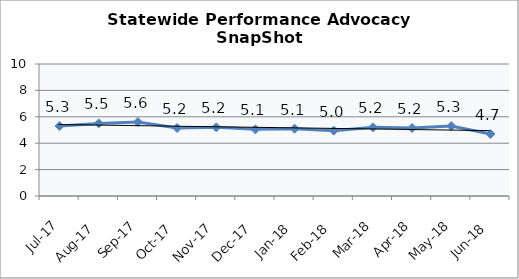
| Category | Statewide |
|---|---|
| Jul-17 | 5.3 |
| Aug-17 | 5.5 |
| Sep-17 | 5.6 |
| Oct-17 | 5.15 |
| Nov-17 | 5.2 |
| Dec-17 | 5.05 |
| Jan-18 | 5.1 |
| Feb-18 | 4.95 |
| Mar-18 | 5.2 |
| Apr-18 | 5.15 |
| May-18 | 5.3 |
| Jun-18 | 4.7 |